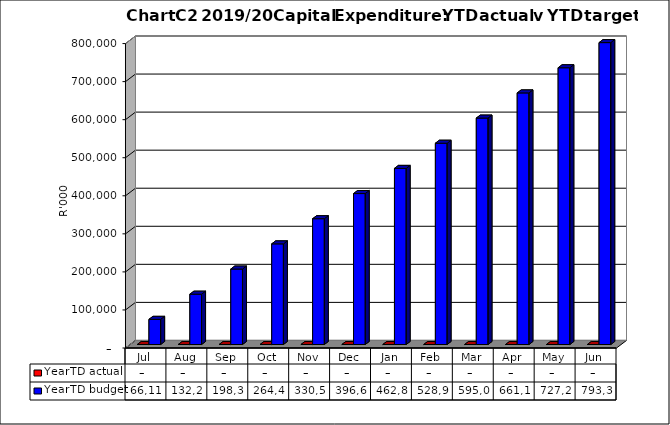
| Category | YearTD actual | YearTD budget |
|---|---|---|
| Jul | 0 | 66115100 |
| Aug | 0 | 132230200 |
| Sep | 0 | 198345300 |
| Oct | 0 | 264460400 |
| Nov | 0 | 330575500 |
| Dec | 0 | 396690600 |
| Jan | 0 | 462805700 |
| Feb | 0 | 528920800 |
| Mar | 0 | 595035900 |
| Apr | 0 | 661151000 |
| May | 0 | 727266100 |
| Jun | 0 | 793381200 |